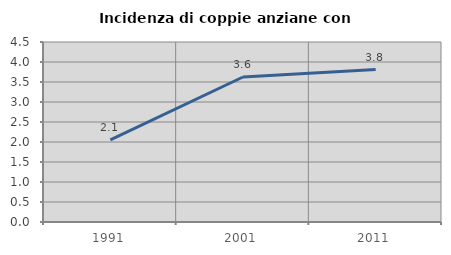
| Category | Incidenza di coppie anziane con figli |
|---|---|
| 1991.0 | 2.052 |
| 2001.0 | 3.625 |
| 2011.0 | 3.81 |